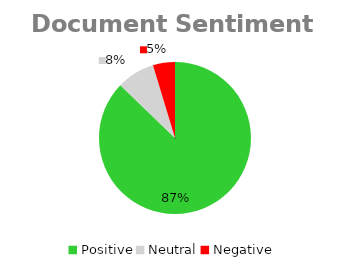
| Category | Document Sentiment Total |
|---|---|
| Positive | 205 |
| Neutral | 19 |
| Negative | 11 |